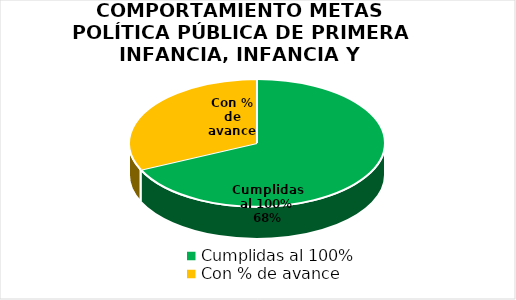
| Category | Series 0 |
|---|---|
| Cumplidas al 100% | 79 |
| Con % de avance | 37 |